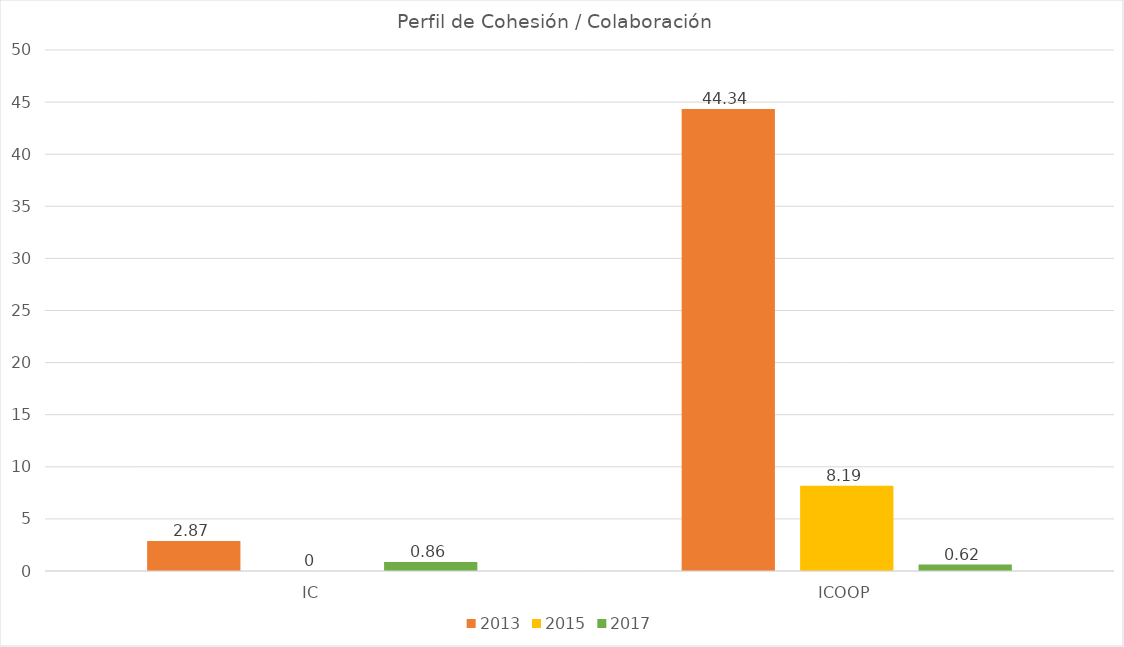
| Category | 2013 | 2015 | 2017 |
|---|---|---|---|
| IC | 2.87 | 0 | 0.86 |
| ICOOP | 44.34 | 8.19 | 0.62 |